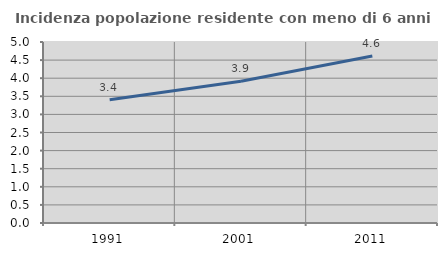
| Category | Incidenza popolazione residente con meno di 6 anni |
|---|---|
| 1991.0 | 3.404 |
| 2001.0 | 3.916 |
| 2011.0 | 4.612 |